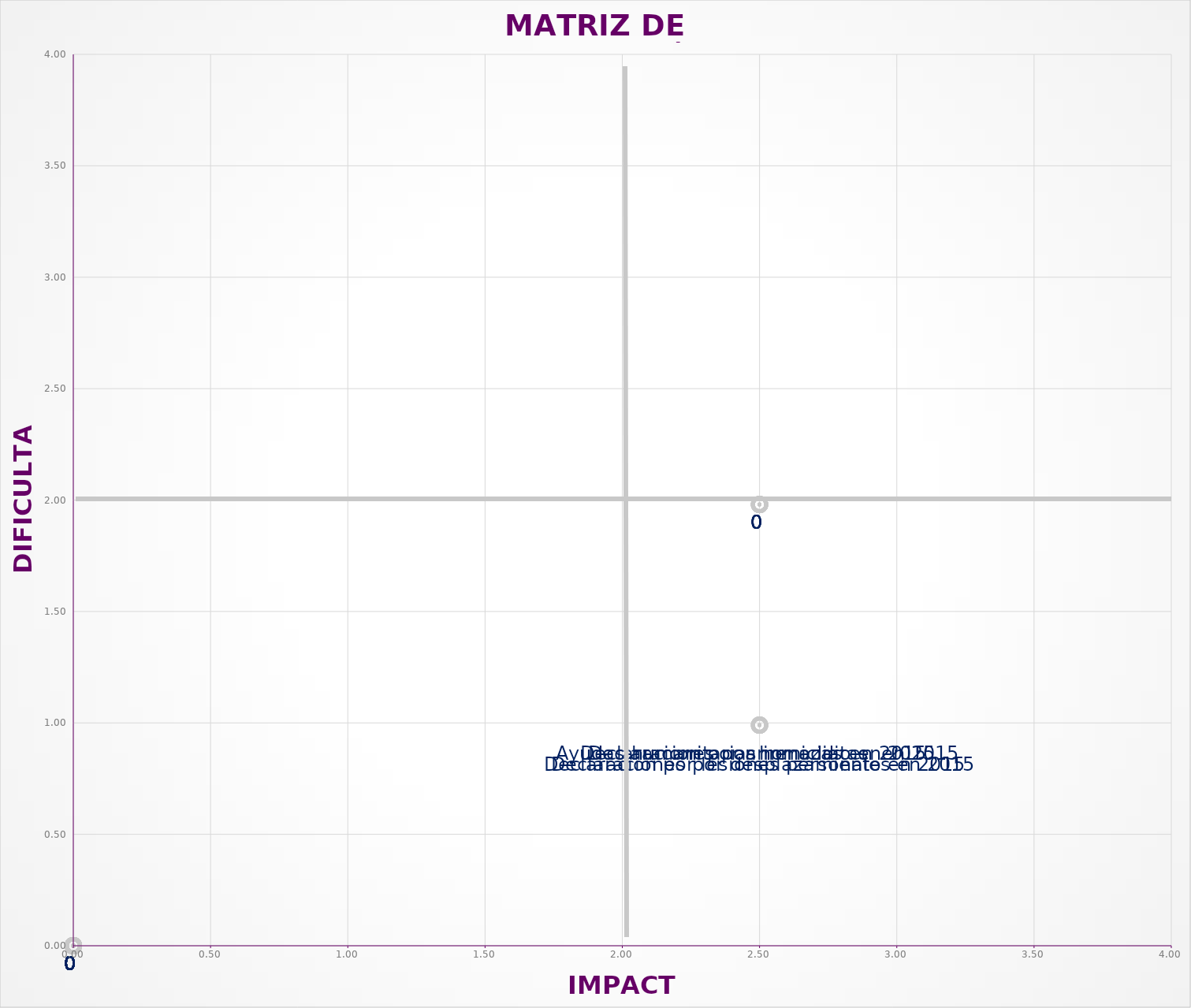
| Category | Series 0 |
|---|---|
| 2.5 | 0.99 |
| 2.5 | 0.99 |
| 2.5 | 0.99 |
| 2.5 | 0.99 |
| 2.5 | 0.99 |
| 2.5 | 1.98 |
| 2.5 | 1.98 |
| 2.5 | 1.98 |
| 2.5 | 1.98 |
| 2.5 | 1.98 |
| 2.5 | 1.98 |
| 2.5 | 1.98 |
| 0.0 | 0 |
| 0.0 | 0 |
| 0.0 | 0 |
| 0.0 | 0 |
| 0.0 | 0 |
| 0.0 | 0 |
| 0.0 | 0 |
| 0.0 | 0 |
| 0.0 | 0 |
| 0.0 | 0 |
| 0.0 | 0 |
| 0.0 | 0 |
| 0.0 | 0 |
| 0.0 | 0 |
| 0.0 | 0 |
| 0.0 | 0 |
| 0.0 | 0 |
| 0.0 | 0 |
| 0.0 | 0 |
| 0.0 | 0 |
| 0.0 | 0 |
| 0.0 | 0 |
| 0.0 | 0 |
| 0.0 | 0 |
| 0.0 | 0 |
| 0.0 | 0 |
| 0.0 | 0 |
| 0.0 | 0 |
| 0.0 | 0 |
| 0.0 | 0 |
| 0.0 | 0 |
| 0.0 | 0 |
| 0.0 | 0 |
| 0.0 | 0 |
| 0.0 | 0 |
| 0.0 | 0 |
| 0.0 | 0 |
| 0.0 | 0 |
| 0.0 | 0 |
| 0.0 | 0 |
| 0.0 | 0 |
| 0.0 | 0 |
| 0.0 | 0 |
| 0.0 | 0 |
| 0.0 | 0 |
| 0.0 | 0 |
| 0.0 | 0 |
| 0.0 | 0 |
| 0.0 | 0 |
| 0.0 | 0 |
| 0.0 | 0 |
| 0.0 | 0 |
| 0.0 | 0 |
| 0.0 | 0 |
| 0.0 | 0 |
| 0.0 | 0 |
| 0.0 | 0 |
| 0.0 | 0 |
| 0.0 | 0 |
| 0.0 | 0 |
| 0.0 | 0 |
| 0.0 | 0 |
| 0.0 | 0 |
| 0.0 | 0 |
| 0.0 | 0 |
| 0.0 | 0 |
| 0.0 | 0 |
| 0.0 | 0 |
| 0.0 | 0 |
| 0.0 | 0 |
| 0.0 | 0 |
| 0.0 | 0 |
| 0.0 | 0 |
| 0.0 | 0 |
| 0.0 | 0 |
| 0.0 | 0 |
| 0.0 | 0 |
| 0.0 | 0 |
| 0.0 | 0 |
| 0.0 | 0 |
| 0.0 | 0 |
| 0.0 | 0 |
| 0.0 | 0 |
| 0.0 | 0 |
| 0.0 | 0 |
| 0.0 | 0 |
| 0.0 | 0 |
| 0.0 | 0 |
| 0.0 | 0 |
| 0.0 | 0 |
| 0.0 | 0 |
| 0.0 | 0 |
| 0.0 | 0 |
| 0.0 | 0 |
| 0.0 | 0 |
| 0.0 | 0 |
| 0.0 | 0 |
| 0.0 | 0 |
| 0.0 | 0 |
| 0.0 | 0 |
| 0.0 | 0 |
| 0.0 | 0 |
| 0.0 | 0 |
| 0.0 | 0 |
| 0.0 | 0 |
| 0.0 | 0 |
| 0.0 | 0 |
| 0.0 | 0 |
| 0.0 | 0 |
| 0.0 | 0 |
| 0.0 | 0 |
| 0.0 | 0 |
| 0.0 | 0 |
| 0.0 | 0 |
| 0.0 | 0 |
| 0.0 | 0 |
| 0.0 | 0 |
| 0.0 | 0 |
| 0.0 | 0 |
| 0.0 | 0 |
| 0.0 | 0 |
| 0.0 | 0 |
| 0.0 | 0 |
| 0.0 | 0 |
| 0.0 | 0 |
| 0.0 | 0 |
| 0.0 | 0 |
| 0.0 | 0 |
| 0.0 | 0 |
| 0.0 | 0 |
| 0.0 | 0 |
| 0.0 | 0 |
| 0.0 | 0 |
| 0.0 | 0 |
| 0.0 | 0 |
| 0.0 | 0 |
| 0.0 | 0 |
| 0.0 | 0 |
| 0.0 | 0 |
| 0.0 | 0 |
| 0.0 | 0 |
| 0.0 | 0 |
| 0.0 | 0 |
| 0.0 | 0 |
| 0.0 | 0 |
| 0.0 | 0 |
| 0.0 | 0 |
| 0.0 | 0 |
| 0.0 | 0 |
| 0.0 | 0 |
| 0.0 | 0 |
| 0.0 | 0 |
| 0.0 | 0 |
| 0.0 | 0 |
| 0.0 | 0 |
| 0.0 | 0 |
| 0.0 | 0 |
| 0.0 | 0 |
| 0.0 | 0 |
| 0.0 | 0 |
| 0.0 | 0 |
| 0.0 | 0 |
| 0.0 | 0 |
| 0.0 | 0 |
| 0.0 | 0 |
| 0.0 | 0 |
| 0.0 | 0 |
| 0.0 | 0 |
| 0.0 | 0 |
| 0.0 | 0 |
| 0.0 | 0 |
| 0.0 | 0 |
| 0.0 | 0 |
| 0.0 | 0 |
| 0.0 | 0 |
| 0.0 | 0 |
| 0.0 | 0 |
| 0.0 | 0 |
| 0.0 | 0 |
| 0.0 | 0 |
| 0.0 | 0 |
| 0.0 | 0 |
| 0.0 | 0 |
| 0.0 | 0 |
| 0.0 | 0 |
| 0.0 | 0 |
| 0.0 | 0 |
| 0.0 | 0 |
| 0.0 | 0 |
| 0.0 | 0 |
| 0.0 | 0 |
| 0.0 | 0 |
| 0.0 | 0 |
| 0.0 | 0 |
| 0.0 | 0 |
| 0.0 | 0 |
| 0.0 | 0 |
| 0.0 | 0 |
| 0.0 | 0 |
| 0.0 | 0 |
| 0.0 | 0 |
| 0.0 | 0 |
| 0.0 | 0 |
| 0.0 | 0 |
| 0.0 | 0 |
| 0.0 | 0 |
| 0.0 | 0 |
| 0.0 | 0 |
| 0.0 | 0 |
| 0.0 | 0 |
| 0.0 | 0 |
| 0.0 | 0 |
| 0.0 | 0 |
| 0.0 | 0 |
| 0.0 | 0 |
| 0.0 | 0 |
| 0.0 | 0 |
| 0.0 | 0 |
| 0.0 | 0 |
| 0.0 | 0 |
| 0.0 | 0 |
| 0.0 | 0 |
| 0.0 | 0 |
| 0.0 | 0 |
| 0.0 | 0 |
| 0.0 | 0 |
| 0.0 | 0 |
| 0.0 | 0 |
| 0.0 | 0 |
| 0.0 | 0 |
| 0.0 | 0 |
| 0.0 | 0 |
| 0.0 | 0 |
| 0.0 | 0 |
| 0.0 | 0 |
| 0.0 | 0 |
| 0.0 | 0 |
| 0.0 | 0 |
| 0.0 | 0 |
| 0.0 | 0 |
| 0.0 | 0 |
| 0.0 | 0 |
| 0.0 | 0 |
| 0.0 | 0 |
| 0.0 | 0 |
| 0.0 | 0 |
| 0.0 | 0 |
| 0.0 | 0 |
| 0.0 | 0 |
| 0.0 | 0 |
| 0.0 | 0 |
| 0.0 | 0 |
| 0.0 | 0 |
| 0.0 | 0 |
| 0.0 | 0 |
| 0.0 | 0 |
| 0.0 | 0 |
| 0.0 | 0 |
| 0.0 | 0 |
| 0.0 | 0 |
| 0.0 | 0 |
| 0.0 | 0 |
| 0.0 | 0 |
| 0.0 | 0 |
| 0.0 | 0 |
| 0.0 | 0 |
| 0.0 | 0 |
| 0.0 | 0 |
| 0.0 | 0 |
| 0.0 | 0 |
| 0.0 | 0 |
| 0.0 | 0 |
| 0.0 | 0 |
| 0.0 | 0 |
| 0.0 | 0 |
| 0.0 | 0 |
| 0.0 | 0 |
| 0.0 | 0 |
| 0.0 | 0 |
| 0.0 | 0 |
| 0.0 | 0 |
| 0.0 | 0 |
| 0.0 | 0 |
| 0.0 | 0 |
| 0.0 | 0 |
| 0.0 | 0 |
| 0.0 | 0 |
| 0.0 | 0 |
| 0.0 | 0 |
| 0.0 | 0 |
| 0.0 | 0 |
| 0.0 | 0 |
| 0.0 | 0 |
| 0.0 | 0 |
| 0.0 | 0 |
| 0.0 | 0 |
| 0.0 | 0 |
| 0.0 | 0 |
| 0.0 | 0 |
| 0.0 | 0 |
| 0.0 | 0 |
| 0.0 | 0 |
| 0.0 | 0 |
| 0.0 | 0 |
| 0.0 | 0 |
| 0.0 | 0 |
| 0.0 | 0 |
| 0.0 | 0 |
| 0.0 | 0 |
| 0.0 | 0 |
| 0.0 | 0 |
| 0.0 | 0 |
| 0.0 | 0 |
| 0.0 | 0 |
| 0.0 | 0 |
| 0.0 | 0 |
| 0.0 | 0 |
| 0.0 | 0 |
| 0.0 | 0 |
| 0.0 | 0 |
| 0.0 | 0 |
| 0.0 | 0 |
| 0.0 | 0 |
| 0.0 | 0 |
| 0.0 | 0 |
| 0.0 | 0 |
| 0.0 | 0 |
| 0.0 | 0 |
| 0.0 | 0 |
| 0.0 | 0 |
| 0.0 | 0 |
| 0.0 | 0 |
| 0.0 | 0 |
| 0.0 | 0 |
| 0.0 | 0 |
| 0.0 | 0 |
| 0.0 | 0 |
| 0.0 | 0 |
| 0.0 | 0 |
| 0.0 | 0 |
| 0.0 | 0 |
| 0.0 | 0 |
| 0.0 | 0 |
| 0.0 | 0 |
| 0.0 | 0 |
| 0.0 | 0 |
| 0.0 | 0 |
| 0.0 | 0 |
| 0.0 | 0 |
| 0.0 | 0 |
| 0.0 | 0 |
| 0.0 | 0 |
| 0.0 | 0 |
| 0.0 | 0 |
| 0.0 | 0 |
| 0.0 | 0 |
| 0.0 | 0 |
| 0.0 | 0 |
| 0.0 | 0 |
| 0.0 | 0 |
| 0.0 | 0 |
| 0.0 | 0 |
| 0.0 | 0 |
| 0.0 | 0 |
| 0.0 | 0 |
| 0.0 | 0 |
| 0.0 | 0 |
| 0.0 | 0 |
| 0.0 | 0 |
| 0.0 | 0 |
| 0.0 | 0 |
| 0.0 | 0 |
| 0.0 | 0 |
| 0.0 | 0 |
| 0.0 | 0 |
| 0.0 | 0 |
| 0.0 | 0 |
| 0.0 | 0 |
| 0.0 | 0 |
| 0.0 | 0 |
| 0.0 | 0 |
| 0.0 | 0 |
| 0.0 | 0 |
| 0.0 | 0 |
| 0.0 | 0 |
| 0.0 | 0 |
| 0.0 | 0 |
| 0.0 | 0 |
| 0.0 | 0 |
| 0.0 | 0 |
| 0.0 | 0 |
| 0.0 | 0 |
| 0.0 | 0 |
| 0.0 | 0 |
| 0.0 | 0 |
| 0.0 | 0 |
| 0.0 | 0 |
| 0.0 | 0 |
| 0.0 | 0 |
| 0.0 | 0 |
| 0.0 | 0 |
| 0.0 | 0 |
| 0.0 | 0 |
| 0.0 | 0 |
| 0.0 | 0 |
| 0.0 | 0 |
| 0.0 | 0 |
| 0.0 | 0 |
| 0.0 | 0 |
| 0.0 | 0 |
| 0.0 | 0 |
| 0.0 | 0 |
| 0.0 | 0 |
| 0.0 | 0 |
| 0.0 | 0 |
| 0.0 | 0 |
| 0.0 | 0 |
| 0.0 | 0 |
| 0.0 | 0 |
| 0.0 | 0 |
| 0.0 | 0 |
| 0.0 | 0 |
| 0.0 | 0 |
| 0.0 | 0 |
| 0.0 | 0 |
| 0.0 | 0 |
| 0.0 | 0 |
| 0.0 | 0 |
| 0.0 | 0 |
| 0.0 | 0 |
| 0.0 | 0 |
| 0.0 | 0 |
| 0.0 | 0 |
| 0.0 | 0 |
| 0.0 | 0 |
| 0.0 | 0 |
| 0.0 | 0 |
| 0.0 | 0 |
| 0.0 | 0 |
| 0.0 | 0 |
| 0.0 | 0 |
| 0.0 | 0 |
| 0.0 | 0 |
| 0.0 | 0 |
| 0.0 | 0 |
| 0.0 | 0 |
| 0.0 | 0 |
| 0.0 | 0 |
| 0.0 | 0 |
| 0.0 | 0 |
| 0.0 | 0 |
| 0.0 | 0 |
| 0.0 | 0 |
| 0.0 | 0 |
| 0.0 | 0 |
| 0.0 | 0 |
| 0.0 | 0 |
| 0.0 | 0 |
| 0.0 | 0 |
| 0.0 | 0 |
| 0.0 | 0 |
| 0.0 | 0 |
| 0.0 | 0 |
| 0.0 | 0 |
| 0.0 | 0 |
| 0.0 | 0 |
| 0.0 | 0 |
| 0.0 | 0 |
| 0.0 | 0 |
| 0.0 | 0 |
| 0.0 | 0 |
| 0.0 | 0 |
| 0.0 | 0 |
| 0.0 | 0 |
| 0.0 | 0 |
| 0.0 | 0 |
| 0.0 | 0 |
| 0.0 | 0 |
| 0.0 | 0 |
| 0.0 | 0 |
| 0.0 | 0 |
| 0.0 | 0 |
| 0.0 | 0 |
| 0.0 | 0 |
| 0.0 | 0 |
| 0.0 | 0 |
| 0.0 | 0 |
| 0.0 | 0 |
| 0.0 | 0 |
| 0.0 | 0 |
| 0.0 | 0 |
| 0.0 | 0 |
| 0.0 | 0 |
| 0.0 | 0 |
| 0.0 | 0 |
| 0.0 | 0 |
| 0.0 | 0 |
| 0.0 | 0 |
| 0.0 | 0 |
| 0.0 | 0 |
| 0.0 | 0 |
| 0.0 | 0 |
| 0.0 | 0 |
| 0.0 | 0 |
| 0.0 | 0 |
| 0.0 | 0 |
| 0.0 | 0 |
| 0.0 | 0 |
| 0.0 | 0 |
| 0.0 | 0 |
| 0.0 | 0 |
| 0.0 | 0 |
| 0.0 | 0 |
| 0.0 | 0 |
| 0.0 | 0 |
| 0.0 | 0 |
| 0.0 | 0 |
| 0.0 | 0 |
| 0.0 | 0 |
| 0.0 | 0 |
| 0.0 | 0 |
| 0.0 | 0 |
| 0.0 | 0 |
| 0.0 | 0 |
| 0.0 | 0 |
| 0.0 | 0 |
| 0.0 | 0 |
| 0.0 | 0 |
| 0.0 | 0 |
| 0.0 | 0 |
| 0.0 | 0 |
| 0.0 | 0 |
| 0.0 | 0 |
| 0.0 | 0 |
| 0.0 | 0 |
| 0.0 | 0 |
| 0.0 | 0 |
| 0.0 | 0 |
| 0.0 | 0 |
| 0.0 | 0 |
| 0.0 | 0 |
| 0.0 | 0 |
| 0.0 | 0 |
| 0.0 | 0 |
| 0.0 | 0 |
| 0.0 | 0 |
| 0.0 | 0 |
| 0.0 | 0 |
| 0.0 | 0 |
| 0.0 | 0 |
| 0.0 | 0 |
| 0.0 | 0 |
| 0.0 | 0 |
| 0.0 | 0 |
| 0.0 | 0 |
| 0.0 | 0 |
| 0.0 | 0 |
| 0.0 | 0 |
| 0.0 | 0 |
| 0.0 | 0 |
| 0.0 | 0 |
| 0.0 | 0 |
| 0.0 | 0 |
| 0.0 | 0 |
| 0.0 | 0 |
| 0.0 | 0 |
| 0.0 | 0 |
| 0.0 | 0 |
| 0.0 | 0 |
| 0.0 | 0 |
| 0.0 | 0 |
| 0.0 | 0 |
| 0.0 | 0 |
| 0.0 | 0 |
| 0.0 | 0 |
| 0.0 | 0 |
| 0.0 | 0 |
| 0.0 | 0 |
| 0.0 | 0 |
| 0.0 | 0 |
| 0.0 | 0 |
| 0.0 | 0 |
| 0.0 | 0 |
| 0.0 | 0 |
| 0.0 | 0 |
| 0.0 | 0 |
| 0.0 | 0 |
| 0.0 | 0 |
| 0.0 | 0 |
| 0.0 | 0 |
| 0.0 | 0 |
| 0.0 | 0 |
| 0.0 | 0 |
| 0.0 | 0 |
| 0.0 | 0 |
| 0.0 | 0 |
| 0.0 | 0 |
| 0.0 | 0 |
| 0.0 | 0 |
| 0.0 | 0 |
| 0.0 | 0 |
| 0.0 | 0 |
| 0.0 | 0 |
| 0.0 | 0 |
| 0.0 | 0 |
| 0.0 | 0 |
| 0.0 | 0 |
| 0.0 | 0 |
| 0.0 | 0 |
| 0.0 | 0 |
| 0.0 | 0 |
| 0.0 | 0 |
| 0.0 | 0 |
| 0.0 | 0 |
| 0.0 | 0 |
| 0.0 | 0 |
| 0.0 | 0 |
| 0.0 | 0 |
| 0.0 | 0 |
| 0.0 | 0 |
| 0.0 | 0 |
| 0.0 | 0 |
| 0.0 | 0 |
| 0.0 | 0 |
| 0.0 | 0 |
| 0.0 | 0 |
| 0.0 | 0 |
| 0.0 | 0 |
| 0.0 | 0 |
| 0.0 | 0 |
| 0.0 | 0 |
| 0.0 | 0 |
| 0.0 | 0 |
| 0.0 | 0 |
| 0.0 | 0 |
| 0.0 | 0 |
| 0.0 | 0 |
| 0.0 | 0 |
| 0.0 | 0 |
| 0.0 | 0 |
| 0.0 | 0 |
| 0.0 | 0 |
| 0.0 | 0 |
| 0.0 | 0 |
| 0.0 | 0 |
| 0.0 | 0 |
| 0.0 | 0 |
| 0.0 | 0 |
| 0.0 | 0 |
| 0.0 | 0 |
| 0.0 | 0 |
| 0.0 | 0 |
| 0.0 | 0 |
| 0.0 | 0 |
| 0.0 | 0 |
| 0.0 | 0 |
| 0.0 | 0 |
| 0.0 | 0 |
| 0.0 | 0 |
| 0.0 | 0 |
| 0.0 | 0 |
| 0.0 | 0 |
| 0.0 | 0 |
| 0.0 | 0 |
| 0.0 | 0 |
| 0.0 | 0 |
| 0.0 | 0 |
| 0.0 | 0 |
| 0.0 | 0 |
| 0.0 | 0 |
| 0.0 | 0 |
| 0.0 | 0 |
| 0.0 | 0 |
| 0.0 | 0 |
| 0.0 | 0 |
| 0.0 | 0 |
| 0.0 | 0 |
| 0.0 | 0 |
| 0.0 | 0 |
| 0.0 | 0 |
| 0.0 | 0 |
| 0.0 | 0 |
| 0.0 | 0 |
| 0.0 | 0 |
| 0.0 | 0 |
| 0.0 | 0 |
| 0.0 | 0 |
| 0.0 | 0 |
| 0.0 | 0 |
| 0.0 | 0 |
| 0.0 | 0 |
| 0.0 | 0 |
| 0.0 | 0 |
| 0.0 | 0 |
| 0.0 | 0 |
| 0.0 | 0 |
| 0.0 | 0 |
| 0.0 | 0 |
| 0.0 | 0 |
| 0.0 | 0 |
| 0.0 | 0 |
| 0.0 | 0 |
| 0.0 | 0 |
| 0.0 | 0 |
| 0.0 | 0 |
| 0.0 | 0 |
| 0.0 | 0 |
| 0.0 | 0 |
| 0.0 | 0 |
| 0.0 | 0 |
| 0.0 | 0 |
| 0.0 | 0 |
| 0.0 | 0 |
| 0.0 | 0 |
| 0.0 | 0 |
| 0.0 | 0 |
| 0.0 | 0 |
| 0.0 | 0 |
| 0.0 | 0 |
| 0.0 | 0 |
| 0.0 | 0 |
| 0.0 | 0 |
| 0.0 | 0 |
| 0.0 | 0 |
| 0.0 | 0 |
| 0.0 | 0 |
| 0.0 | 0 |
| 0.0 | 0 |
| 0.0 | 0 |
| 0.0 | 0 |
| 0.0 | 0 |
| 0.0 | 0 |
| 0.0 | 0 |
| 0.0 | 0 |
| 0.0 | 0 |
| 0.0 | 0 |
| 0.0 | 0 |
| 0.0 | 0 |
| 0.0 | 0 |
| 0.0 | 0 |
| 0.0 | 0 |
| 0.0 | 0 |
| 0.0 | 0 |
| 0.0 | 0 |
| 0.0 | 0 |
| 0.0 | 0 |
| 0.0 | 0 |
| 0.0 | 0 |
| 0.0 | 0 |
| 0.0 | 0 |
| 0.0 | 0 |
| 0.0 | 0 |
| 0.0 | 0 |
| 0.0 | 0 |
| 0.0 | 0 |
| 0.0 | 0 |
| 0.0 | 0 |
| 0.0 | 0 |
| 0.0 | 0 |
| 0.0 | 0 |
| 0.0 | 0 |
| 0.0 | 0 |
| 0.0 | 0 |
| 0.0 | 0 |
| 0.0 | 0 |
| 0.0 | 0 |
| 0.0 | 0 |
| 0.0 | 0 |
| 0.0 | 0 |
| 0.0 | 0 |
| 0.0 | 0 |
| 0.0 | 0 |
| 0.0 | 0 |
| 0.0 | 0 |
| 0.0 | 0 |
| 0.0 | 0 |
| 0.0 | 0 |
| 0.0 | 0 |
| 0.0 | 0 |
| 0.0 | 0 |
| 0.0 | 0 |
| 0.0 | 0 |
| 0.0 | 0 |
| 0.0 | 0 |
| 0.0 | 0 |
| 0.0 | 0 |
| 0.0 | 0 |
| 0.0 | 0 |
| 0.0 | 0 |
| 0.0 | 0 |
| 0.0 | 0 |
| 0.0 | 0 |
| 0.0 | 0 |
| 0.0 | 0 |
| 0.0 | 0 |
| 0.0 | 0 |